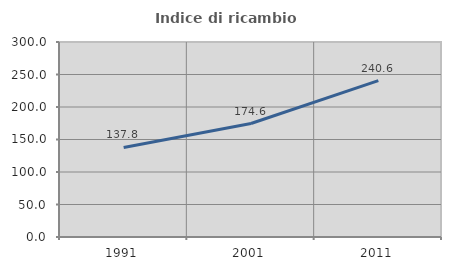
| Category | Indice di ricambio occupazionale  |
|---|---|
| 1991.0 | 137.803 |
| 2001.0 | 174.603 |
| 2011.0 | 240.576 |